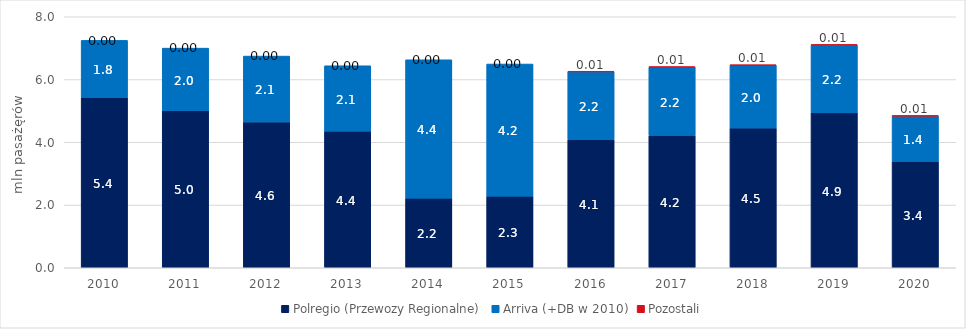
| Category | Polregio (Przewozy Regionalne) | Arriva (+DB w 2010) | Pozostali |
|---|---|---|---|
| 2010 | 5.424 | 1.823 | 0 |
| 2011 | 5.005 | 1.996 | 0 |
| 2012 | 4.647 | 2.1 | 0 |
| 2013 | 4.353 | 2.085 | 0 |
| 2014 | 2.215 | 4.415 | 0 |
| 2015 | 2.279 | 4.216 | 0 |
| 2016 | 4.081 | 2.168 | 0.008 |
| 2017 | 4.217 | 2.179 | 0.007 |
| 2018 | 4.453 | 2.003 | 0.008 |
| 2019 | 4.936 | 2.163 | 0.014 |
| 2020 | 3.389 | 1.449 | 0.008 |